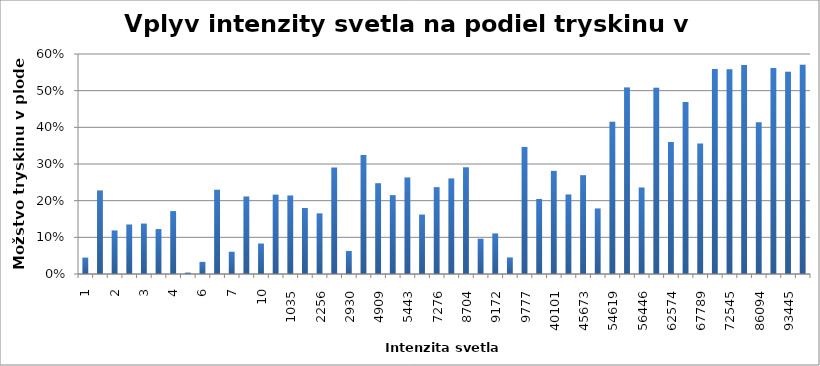
| Category | Series 0 |
|---|---|
| 1.03 | 0.045 |
| 1.48 | 0.228 |
| 2.32 | 0.119 |
| 2.75 | 0.135 |
| 3.27 | 0.137 |
| 3.79 | 0.123 |
| 3.98 | 0.172 |
| 5.45 | 0.004 |
| 5.56 | 0.033 |
| 5.61 | 0.23 |
| 7.47 | 0.061 |
| 7.48 | 0.211 |
| 9.87 | 0.083 |
| 425.73 | 0.216 |
| 1034.98 | 0.214 |
| 2159.51 | 0.18 |
| 2256.07 | 0.165 |
| 2769.72 | 0.29 |
| 2930.14 | 0.063 |
| 3719.09 | 0.325 |
| 4908.82 | 0.248 |
| 5200.64 | 0.215 |
| 5442.85 | 0.263 |
| 5950.71 | 0.162 |
| 7275.96 | 0.237 |
| 8236.12 | 0.261 |
| 8703.93 | 0.291 |
| 8775.52 | 0.096 |
| 9171.91 | 0.111 |
| 9308.81 | 0.045 |
| 9777.02 | 0.347 |
| 37994.33 | 0.205 |
| 40100.93 | 0.281 |
| 43926.26 | 0.217 |
| 45672.74 | 0.27 |
| 46493.14 | 0.179 |
| 54619.47 | 0.415 |
| 55000.16 | 0.509 |
| 56446.1 | 0.236 |
| 60700.63 | 0.508 |
| 62573.53 | 0.36 |
| 65945.01 | 0.469 |
| 67788.6 | 0.356 |
| 69497.02 | 0.559 |
| 72545.2 | 0.559 |
| 74827.3 | 0.57 |
| 86094.31 | 0.414 |
| 86450.5 | 0.562 |
| 93444.87 | 0.551 |
| 99361.41 | 0.571 |